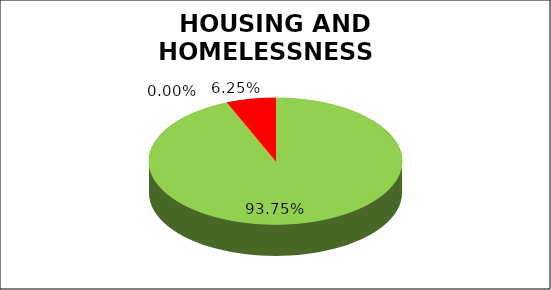
| Category | Series 0 |
|---|---|
| Green | 0.938 |
| Amber | 0 |
| Red | 0.062 |